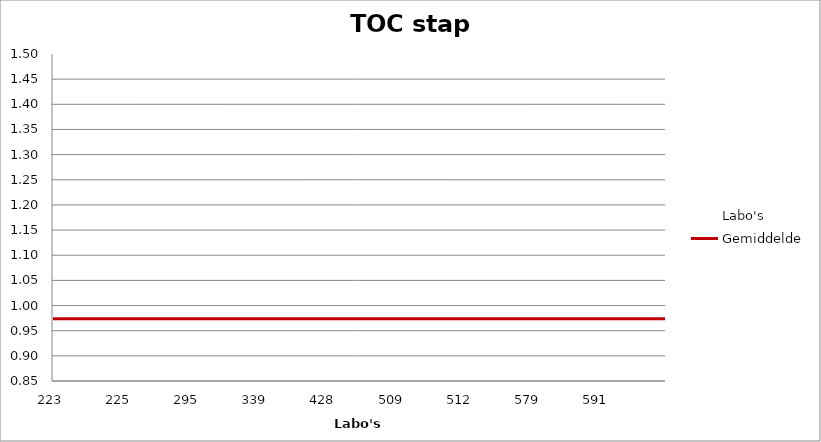
| Category | Labo's | Gemiddelde |
|---|---|---|
| 223.0 | 0.99 | 0.974 |
| 225.0 | 0.86 | 0.974 |
| 295.0 | 0.98 | 0.974 |
| 339.0 | 1.5 | 0.974 |
| 428.0 | 0.99 | 0.974 |
| 509.0 | 1 | 0.974 |
| 512.0 | 1.02 | 0.974 |
| 579.0 | 0.94 | 0.974 |
| 591.0 | 0.91 | 0.974 |